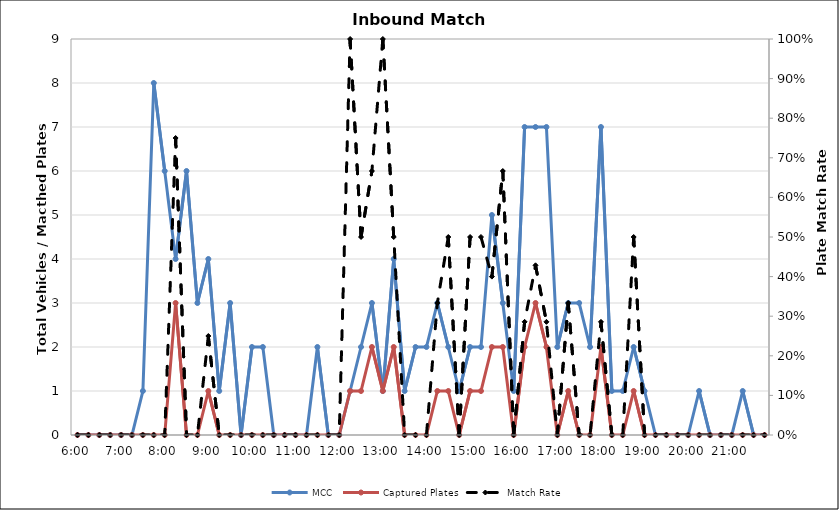
| Category | MCC | Captured Plates |
|---|---|---|
| 0.25 | 0 | 0 |
| 0.260416666666667 | 0 | 0 |
| 0.270833333333333 | 0 | 0 |
| 0.28125 | 0 | 0 |
| 0.291666666666667 | 0 | 0 |
| 0.302083333333333 | 0 | 0 |
| 0.3125 | 1 | 0 |
| 0.322916666666667 | 8 | 0 |
| 0.333333333333333 | 6 | 0 |
| 0.34375 | 4 | 3 |
| 0.354166666666667 | 6 | 0 |
| 0.364583333333333 | 3 | 0 |
| 0.375 | 4 | 1 |
| 0.385416666666667 | 1 | 0 |
| 0.395833333333333 | 3 | 0 |
| 0.40625 | 0 | 0 |
| 0.416666666666667 | 2 | 0 |
| 0.427083333333333 | 2 | 0 |
| 0.4375 | 0 | 0 |
| 0.447916666666667 | 0 | 0 |
| 0.458333333333333 | 0 | 0 |
| 0.46875 | 0 | 0 |
| 0.479166666666667 | 2 | 0 |
| 0.489583333333333 | 0 | 0 |
| 0.5 | 0 | 0 |
| 0.510416666666667 | 1 | 1 |
| 0.520833333333333 | 2 | 1 |
| 0.53125 | 3 | 2 |
| 0.541666666666667 | 1 | 1 |
| 0.552083333333333 | 4 | 2 |
| 0.5625 | 1 | 0 |
| 0.572916666666667 | 2 | 0 |
| 0.583333333333333 | 2 | 0 |
| 0.59375 | 3 | 1 |
| 0.604166666666667 | 2 | 1 |
| 0.614583333333333 | 1 | 0 |
| 0.625 | 2 | 1 |
| 0.635416666666667 | 2 | 1 |
| 0.645833333333333 | 5 | 2 |
| 0.65625 | 3 | 2 |
| 0.666666666666667 | 1 | 0 |
| 0.677083333333333 | 7 | 2 |
| 0.6875 | 7 | 3 |
| 0.697916666666667 | 7 | 2 |
| 0.708333333333333 | 2 | 0 |
| 0.71875 | 3 | 1 |
| 0.729166666666667 | 3 | 0 |
| 0.739583333333333 | 2 | 0 |
| 0.75 | 7 | 2 |
| 0.760416666666667 | 1 | 0 |
| 0.770833333333333 | 1 | 0 |
| 0.78125 | 2 | 1 |
| 0.791666666666667 | 1 | 0 |
| 0.802083333333333 | 0 | 0 |
| 0.8125 | 0 | 0 |
| 0.822916666666667 | 0 | 0 |
| 0.833333333333333 | 0 | 0 |
| 0.84375 | 1 | 0 |
| 0.854166666666667 | 0 | 0 |
| 0.864583333333333 | 0 | 0 |
| 0.875 | 0 | 0 |
| 0.885416666666667 | 1 | 0 |
| 0.895833333333333 | 0 | 0 |
| 0.90625 | 0 | 0 |